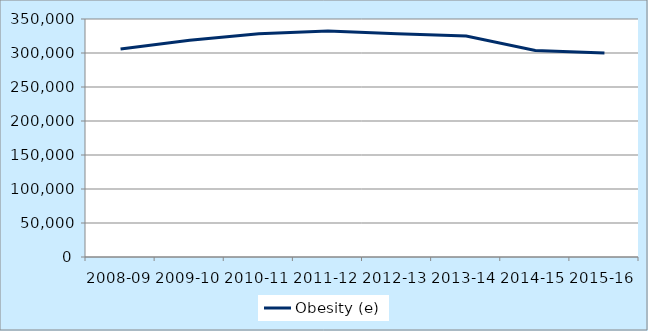
| Category | Obesity (e) |
|---|---|
| 2008-09 | 305923 |
| 2009-10 | 318606 |
| 2010-11 | 328283 |
| 2011-12 | 332229 |
| 2012-13 | 328418 |
| 2013-14 | 324878 |
| 2014-15 | 303634 |
| 2015-16 | 300050 |